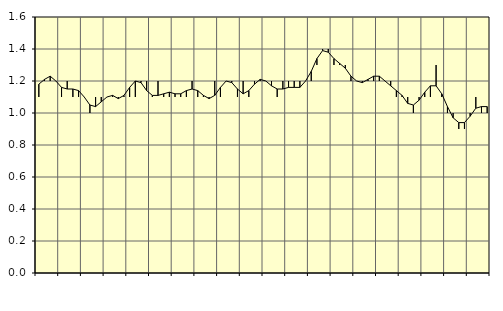
| Category | Piggar | Jordbruk, skogsbruk o fiske, SNI 01-03 |
|---|---|---|
| nan | 1.1 | 1.18 |
| 1.0 | 1.2 | 1.21 |
| 1.0 | 1.2 | 1.23 |
| 1.0 | 1.2 | 1.2 |
| nan | 1.1 | 1.16 |
| 2.0 | 1.2 | 1.15 |
| 2.0 | 1.1 | 1.15 |
| 2.0 | 1.1 | 1.14 |
| nan | 1.1 | 1.1 |
| 3.0 | 1 | 1.05 |
| 3.0 | 1.1 | 1.04 |
| 3.0 | 1.1 | 1.07 |
| nan | 1.1 | 1.1 |
| 4.0 | 1.1 | 1.11 |
| 4.0 | 1.1 | 1.09 |
| 4.0 | 1.1 | 1.11 |
| nan | 1.1 | 1.16 |
| 5.0 | 1.1 | 1.2 |
| 5.0 | 1.2 | 1.19 |
| 5.0 | 1.2 | 1.14 |
| nan | 1.1 | 1.11 |
| 6.0 | 1.2 | 1.11 |
| 6.0 | 1.1 | 1.12 |
| 6.0 | 1.1 | 1.13 |
| nan | 1.1 | 1.12 |
| 7.0 | 1.1 | 1.12 |
| 7.0 | 1.1 | 1.14 |
| 7.0 | 1.2 | 1.15 |
| nan | 1.1 | 1.14 |
| 8.0 | 1.1 | 1.11 |
| 8.0 | 1.1 | 1.09 |
| 8.0 | 1.2 | 1.11 |
| nan | 1.1 | 1.16 |
| 9.0 | 1.2 | 1.2 |
| 9.0 | 1.2 | 1.19 |
| 9.0 | 1.1 | 1.15 |
| nan | 1.2 | 1.12 |
| 10.0 | 1.1 | 1.14 |
| 10.0 | 1.2 | 1.18 |
| 10.0 | 1.2 | 1.21 |
| nan | 1.2 | 1.2 |
| 11.0 | 1.2 | 1.17 |
| 11.0 | 1.1 | 1.15 |
| 11.0 | 1.2 | 1.15 |
| nan | 1.2 | 1.16 |
| 12.0 | 1.2 | 1.16 |
| 12.0 | 1.2 | 1.16 |
| 12.0 | 1.2 | 1.2 |
| nan | 1.2 | 1.26 |
| 13.0 | 1.3 | 1.34 |
| 13.0 | 1.4 | 1.39 |
| 13.0 | 1.4 | 1.38 |
| nan | 1.3 | 1.34 |
| 14.0 | 1.3 | 1.31 |
| 14.0 | 1.3 | 1.28 |
| 14.0 | 1.2 | 1.23 |
| nan | 1.2 | 1.2 |
| 15.0 | 1.2 | 1.19 |
| 15.0 | 1.2 | 1.21 |
| 15.0 | 1.2 | 1.23 |
| nan | 1.2 | 1.23 |
| 16.0 | 1.2 | 1.2 |
| 16.0 | 1.2 | 1.17 |
| 16.0 | 1.1 | 1.14 |
| nan | 1.1 | 1.11 |
| 17.0 | 1.1 | 1.06 |
| 17.0 | 1 | 1.05 |
| 17.0 | 1.1 | 1.08 |
| nan | 1.1 | 1.13 |
| 18.0 | 1.1 | 1.17 |
| 18.0 | 1.3 | 1.17 |
| 18.0 | 1.1 | 1.12 |
| nan | 1 | 1.04 |
| 19.0 | 1 | 0.97 |
| 19.0 | 0.9 | 0.94 |
| 19.0 | 0.9 | 0.94 |
| nan | 1 | 0.98 |
| 20.0 | 1.1 | 1.03 |
| 20.0 | 1 | 1.04 |
| 20.0 | 1 | 1.04 |